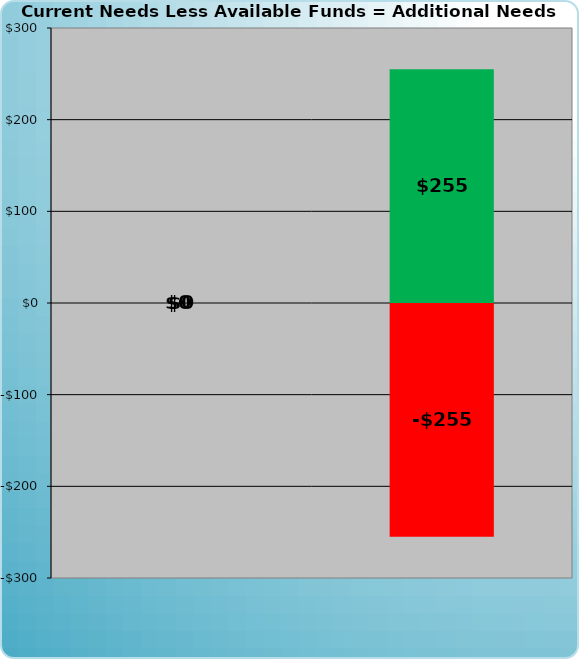
| Category | Series 0 | Series 1 |
|---|---|---|
| 0 | 0 | 0 |
| 1 | 255 | -255 |